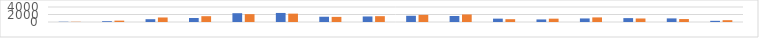
| Category | Series 0 | Series 1 |
|---|---|---|
| 7:00-8:00 | 68 | 64 |
| 8:00-9:00 | 208 | 364 |
| 9:00-10:00 | 748 | 1204 |
| 10:00-11:00 | 1068 | 1548 |
| 11:00-12:00 | 2348 | 2096 |
| 12:00-13:00 | 2412 | 2228 |
| 13:00-14:00 | 1404 | 1364 |
| 14:00-15:00 | 1476 | 1556 |
| 15:00-16:00 | 1660 | 1904 |
| 16:00-17:00 | 1608 | 2008 |
| 17:00-18:00 | 896 | 748 |
| 18:00-19:00 | 684 | 888 |
| 19:00-20:00 | 948 | 1224 |
| 20:00-21:00 | 1036 | 936 |
| 21:00-22:00 | 960 | 788 |
| 22:00-23:00 | 312 | 484 |